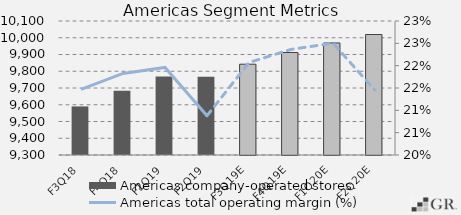
| Category | Americas company-operated stores |
|---|---|
|  F3Q18  | 9590 |
|  F4Q18  | 9684 |
|  F1Q19  | 9768 |
|  F2Q19  | 9767 |
|  F3Q19E  | 9842 |
|  F4Q19E  | 9912 |
|  F1Q20E  | 9969 |
|  F2Q20E  | 10019.25 |